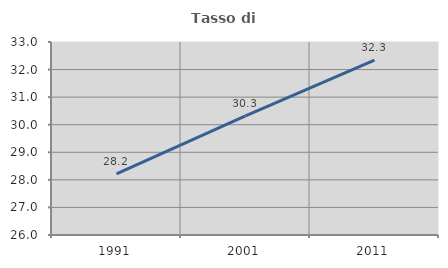
| Category | Tasso di occupazione   |
|---|---|
| 1991.0 | 28.214 |
| 2001.0 | 30.324 |
| 2011.0 | 32.339 |